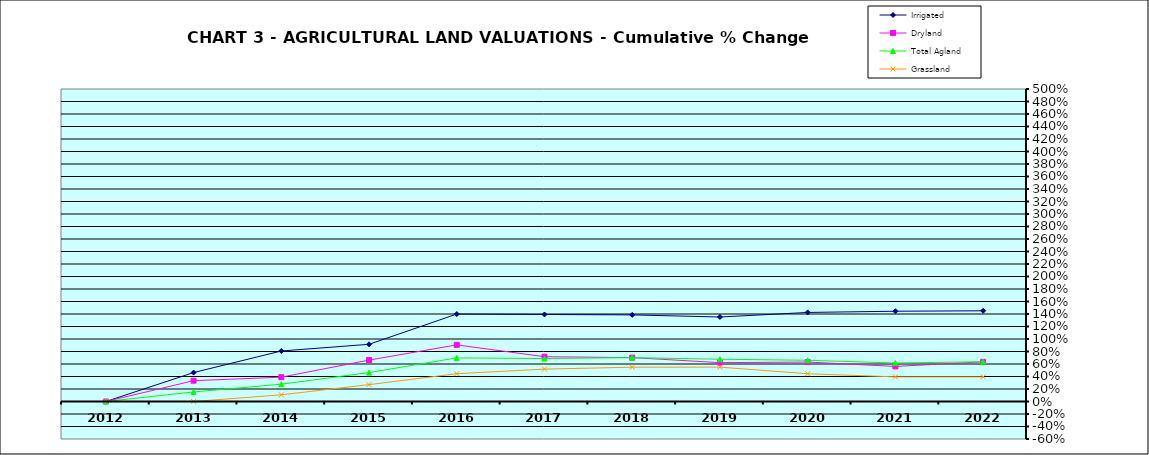
| Category | Irrigated | Dryland | Total Agland | Grassland |
|---|---|---|---|---|
| 2012.0 | 0 | 0 | 0 | 0 |
| 2013.0 | 0.463 | 0.333 | 0.153 | 0 |
| 2014.0 | 0.808 | 0.389 | 0.277 | 0.107 |
| 2015.0 | 0.915 | 0.663 | 0.463 | 0.27 |
| 2016.0 | 1.399 | 0.906 | 0.698 | 0.445 |
| 2017.0 | 1.392 | 0.717 | 0.687 | 0.518 |
| 2018.0 | 1.386 | 0.702 | 0.702 | 0.549 |
| 2019.0 | 1.352 | 0.622 | 0.676 | 0.55 |
| 2020.0 | 1.425 | 0.631 | 0.66 | 0.444 |
| 2021.0 | 1.444 | 0.561 | 0.616 | 0.394 |
| 2022.0 | 1.451 | 0.635 | 0.636 | 0.393 |